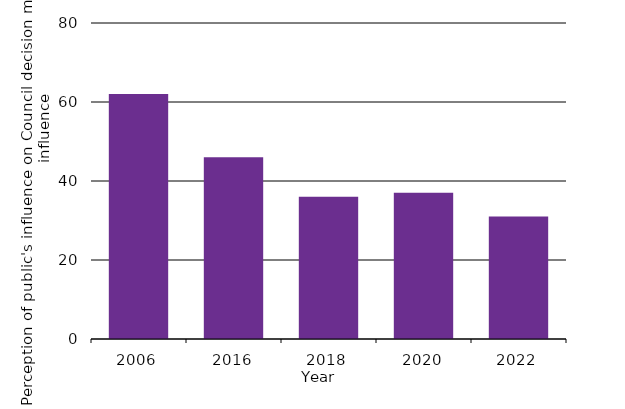
| Category | Perception of public's influence on Council decision making - Some or large influence |
|---|---|
| 2006.0 | 62 |
| 2016.0 | 46 |
| 2018.0 | 36 |
| 2020.0 | 37 |
| 2022.0 | 31 |